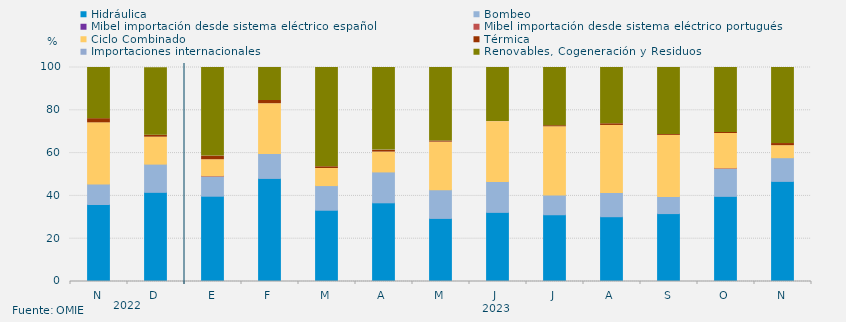
| Category | Hidráulica | Bombeo | Mibel importación desde sistema eléctrico español | Mibel importación desde sistema eléctrico portugués | Ciclo Combinado | Térmica | Importaciones internacionales | Renovables, Cogeneración y Residuos |
|---|---|---|---|---|---|---|---|---|
| N | 35.972 | 9.537 | 0 | 0 | 28.634 | 1.944 | 0 | 23.912 |
| D | 41.662 | 13.19 | 0 | 0 | 12.59 | 0.914 | 0 | 31.537 |
| E | 39.852 | 9.42 | 0 | 0.134 | 7.493 | 1.703 | 0 | 41.398 |
| F | 48.165 | 11.657 | 0 | 0 | 23.264 | 1.488 | 0 | 15.427 |
| M | 33.3 | 11.519 | 0 | 0 | 7.974 | 0.83 | 0 | 46.377 |
| A | 36.771 | 14.433 | 0 | 0 | 9.271 | 0.88 | 0.069 | 38.576 |
| M | 29.48 | 13.418 | 0 | 0 | 22.222 | 0.538 | 0 | 34.341 |
| J | 32.303 | 14.468 | 0 | 0 | 27.905 | 0.035 | 0 | 25.289 |
| J | 31.194 | 9.218 | 0 | 0 | 31.888 | 0.515 | 0 | 27.184 |
| A | 30.276 | 11.279 | 0 | 0 | 31.362 | 0.795 | 0 | 26.288 |
| S | 31.736 | 7.94 | 0 | 0 | 28.611 | 0.463 | 0 | 31.25 |
| O | 39.785 | 13.172 | 0 | 0.134 | 16.062 | 0.493 | 0 | 30.354 |
| N | 46.782 | 11.065 | 0 | 0 | 5.625 | 0.995 | 0 | 35.532 |